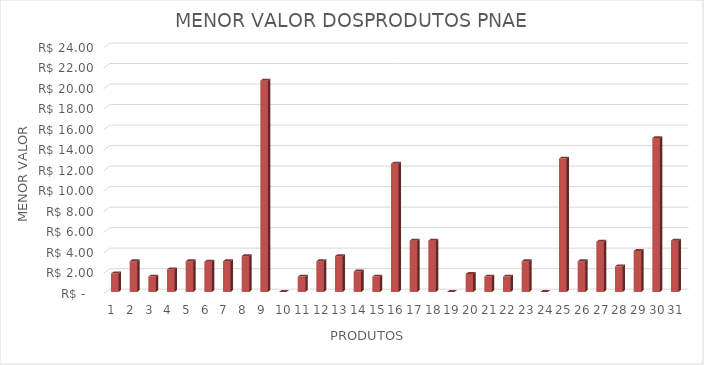
| Category | Series 0 |
|---|---|
| 0 | 1.8 |
| 1 | 3 |
| 2 | 1.5 |
| 3 | 2.2 |
| 4 | 3 |
| 5 | 2.95 |
| 6 | 3 |
| 7 | 3.5 |
| 8 | 20.6 |
| 9 | 0 |
| 10 | 1.5 |
| 11 | 3 |
| 12 | 3.5 |
| 13 | 2 |
| 14 | 1.5 |
| 15 | 12.5 |
| 16 | 5 |
| 17 | 5 |
| 18 | 0 |
| 19 | 1.75 |
| 20 | 1.5 |
| 21 | 1.5 |
| 22 | 3 |
| 23 | 0 |
| 24 | 13 |
| 25 | 3 |
| 26 | 4.9 |
| 27 | 2.5 |
| 28 | 4 |
| 29 | 15 |
| 30 | 5 |